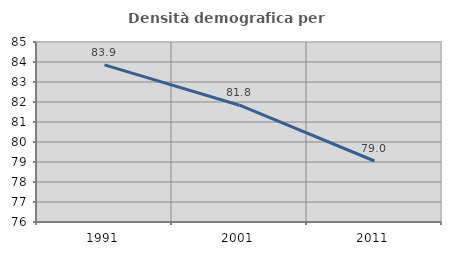
| Category | Densità demografica |
|---|---|
| 1991.0 | 83.859 |
| 2001.0 | 81.84 |
| 2011.0 | 79.049 |